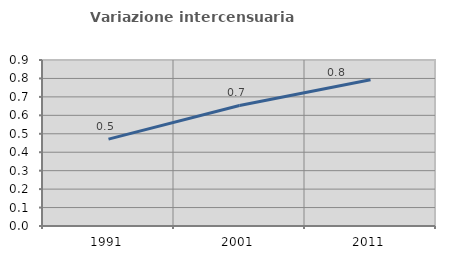
| Category | Variazione intercensuaria annua |
|---|---|
| 1991.0 | 0.471 |
| 2001.0 | 0.653 |
| 2011.0 | 0.793 |